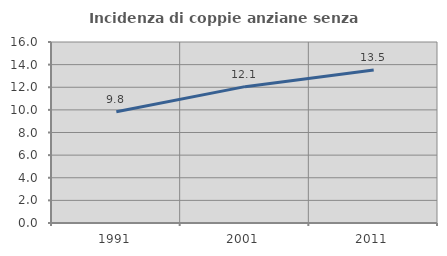
| Category | Incidenza di coppie anziane senza figli  |
|---|---|
| 1991.0 | 9.836 |
| 2001.0 | 12.054 |
| 2011.0 | 13.527 |